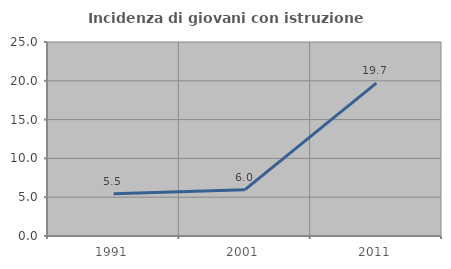
| Category | Incidenza di giovani con istruzione universitaria |
|---|---|
| 1991.0 | 5.455 |
| 2001.0 | 5.97 |
| 2011.0 | 19.697 |